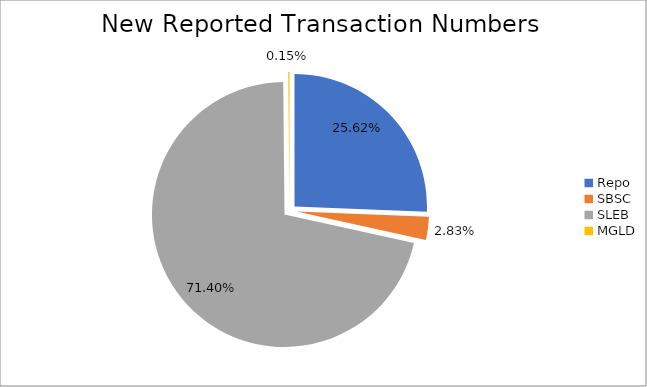
| Category | Series 0 |
|---|---|
| Repo | 452711 |
| SBSC | 49938 |
| SLEB | 1261846 |
| MGLD | 2706 |